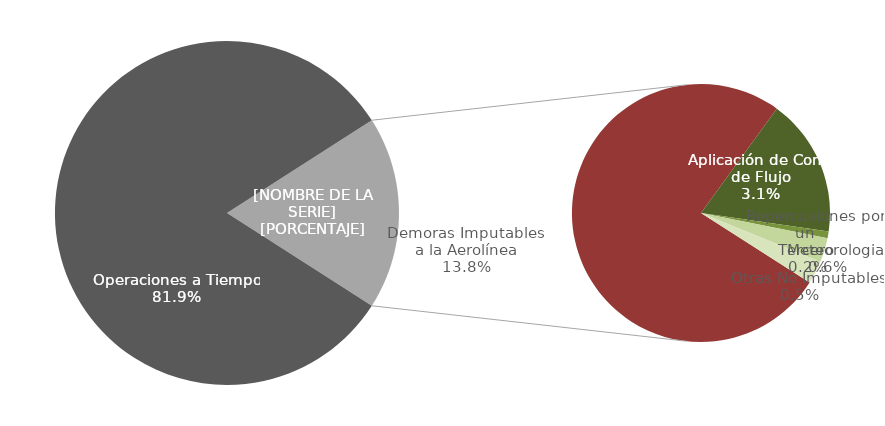
| Category | Demoras |
|---|---|
| Operaciones a Tiempo | 2664 |
| Demoras Imputables 
a la Aerolínea | 448 |
|    Aplicación de Control 
de Flujo | 102 |
|    Repercusiones por un 
Tercero | 5 |
|    Meteorologia | 18 |
|    Otras No Imputables | 17 |